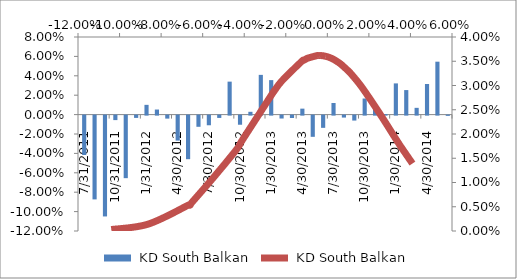
| Category |  KD South Balkan |
|---|---|
| 31/07/2011 | -0.041 |
| 31/08/2011 | -0.086 |
| 30/09/2011 | -0.104 |
| 31/10/2011 | -0.005 |
| 30/11/2011 | -0.064 |
| 31/12/2011 | -0.002 |
| 31/01/2012 | 0.01 |
| 29/02/2012 | 0.005 |
| 31/03/2012 | -0.003 |
| 30/04/2012 | -0.026 |
| 31/05/2012 | -0.045 |
| 30/06/2012 | -0.012 |
| 31/07/2012 | -0.01 |
| 31/08/2012 | -0.002 |
| 30/09/2012 | 0.034 |
| 31/10/2012 | -0.009 |
| 30/11/2012 | 0.003 |
| 31/12/2012 | 0.041 |
| 31/01/2013 | 0.036 |
| 28/02/2013 | -0.003 |
| 31/03/2013 | -0.002 |
| 30/04/2013 | 0.006 |
| 31/05/2013 | -0.022 |
| 30/06/2013 | -0.013 |
| 31/07/2013 | 0.012 |
| 31/08/2013 | -0.002 |
| 30/09/2013 | -0.005 |
| 31/10/2013 | 0.017 |
| 30/11/2013 | 0.006 |
| 31/12/2013 | 0.001 |
| 31/01/2014 | 0.032 |
| 28/02/2014 | 0.025 |
| 31/03/2014 | 0.007 |
| 30/04/2014 | 0.032 |
| 31/05/2014 | 0.055 |
| 30/06/2014 | 0 |